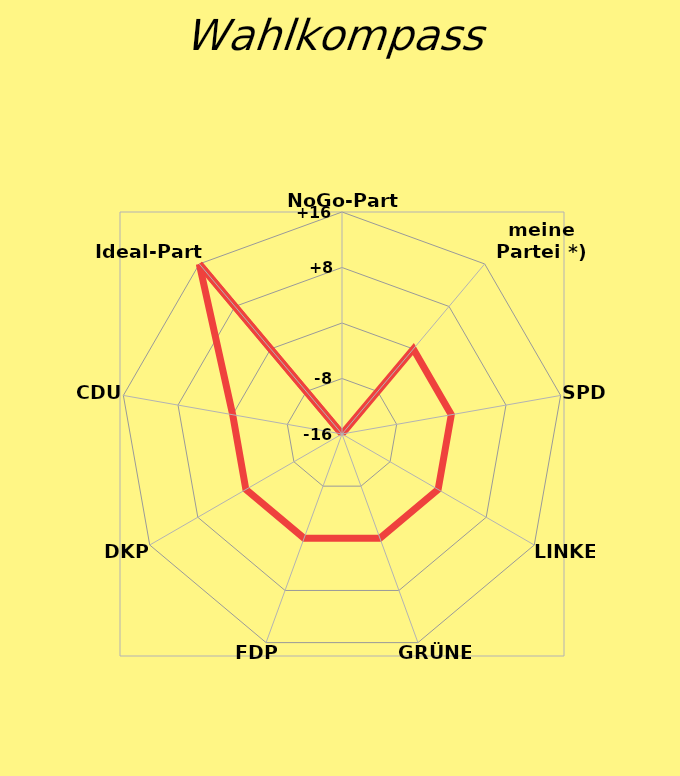
| Category | Series 0 |
|---|---|
| NoGo-Partei | -16 |
| meine Partei *) | 0 |
| SPD | 0 |
| LINKE | 0 |
| GRÜNE | 0 |
| FDP | 0 |
| DKP | 0 |
| CDU | 0 |
| Ideal-Partei | 16 |